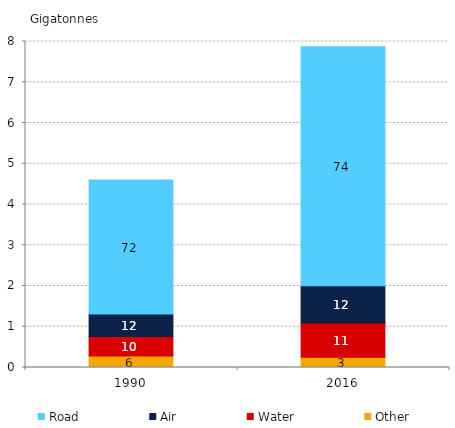
| Category | Other | Water | Air | Road |
|---|---|---|---|---|
| 1990.0 | 0.285 | 0.474 | 0.553 | 3.289 |
| 2016.0 | 0.253 | 0.838 | 0.917 | 5.866 |